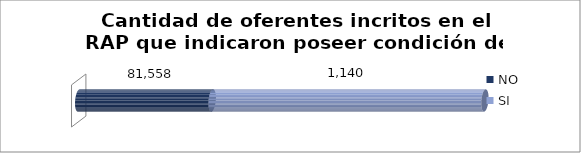
| Category | NO | SI |
|---|---|---|
| 0 | 81558 | 1140 |